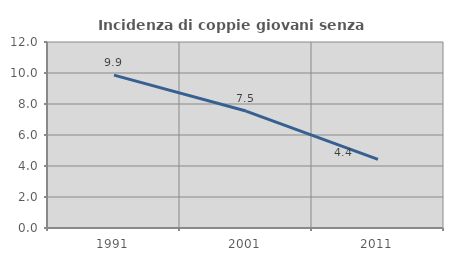
| Category | Incidenza di coppie giovani senza figli |
|---|---|
| 1991.0 | 9.862 |
| 2001.0 | 7.545 |
| 2011.0 | 4.424 |